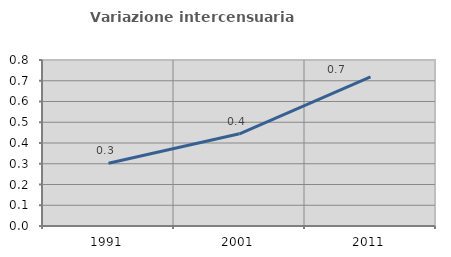
| Category | Variazione intercensuaria annua |
|---|---|
| 1991.0 | 0.302 |
| 2001.0 | 0.444 |
| 2011.0 | 0.719 |